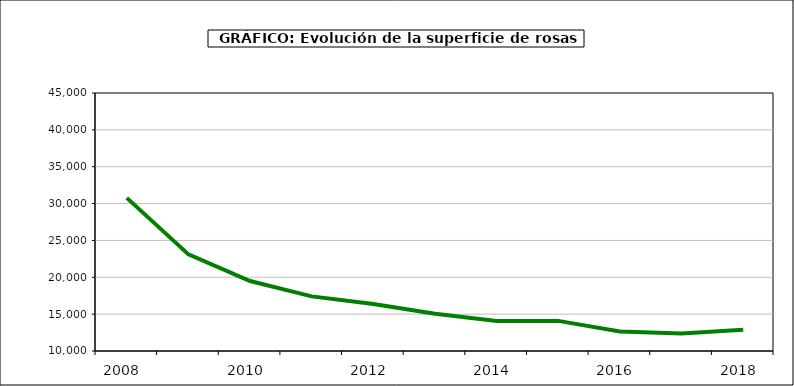
| Category | superficie |
|---|---|
| 2008.0 | 30773 |
| 2009.0 | 23105 |
| 2010.0 | 19496 |
| 2011.0 | 17410 |
| 2012.0 | 16373 |
| 2013.0 | 15043 |
| 2014.0 | 14063 |
| 2015.0 | 14086 |
| 2016.0 | 12651 |
| 2017.0 | 12371 |
| 2018.0 | 12895 |